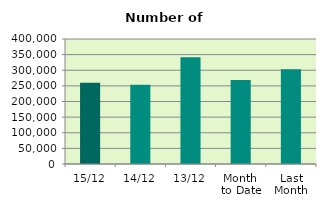
| Category | Series 0 |
|---|---|
| 15/12 | 259792 |
| 14/12 | 253320 |
| 13/12 | 341496 |
| Month 
to Date | 269136.545 |
| Last
Month | 303258.727 |